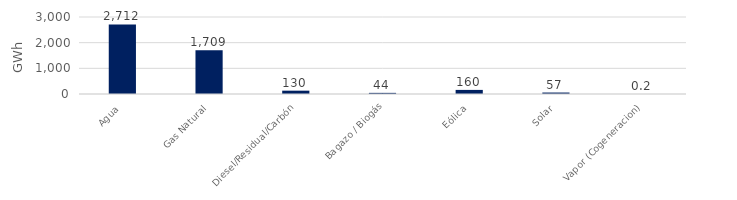
| Category | Series 0 |
|---|---|
| Agua | 2712.485 |
| Gas Natural | 1708.821 |
| Diesel/Residual/Carbón | 130.02 |
| Bagazo / Biogás | 44.143 |
| Eólica | 159.627 |
| Solar | 57.131 |
| Vapor (Cogeneracion) | 0.186 |